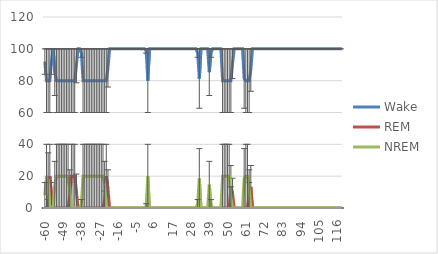
| Category | Wake | REM | NREM |
|---|---|---|---|
| -60.0 | 92 | 0 | 8 |
| -59.0 | 80 | 0 | 20 |
| -58.0 | 80 | 2.66 | 17.34 |
| -57.0 | 80 | 20 | 0 |
| -56.0 | 92 | 8 | 0 |
| -55.0 | 100 | 0 | 0 |
| -54.0 | 85.34 | 0 | 14.66 |
| -53.0 | 80 | 0 | 20 |
| -52.0 | 80 | 0 | 20 |
| -51.0 | 80 | 0 | 20 |
| -50.0 | 80 | 0 | 20 |
| -49.0 | 80 | 0 | 20 |
| -48.0 | 80 | 0 | 20 |
| -47.0 | 80 | 0 | 20 |
| -46.0 | 80 | 0 | 20 |
| -45.0 | 80 | 8 | 12 |
| -44.0 | 80 | 20 | 0 |
| -43.0 | 80 | 20 | 0 |
| -42.0 | 80 | 20 | 0 |
| -41.0 | 89.34 | 10.66 | 0 |
| -40.0 | 100 | 0 | 0 |
| -39.0 | 100 | 0 | 0 |
| -38.0 | 97.34 | 0 | 2.66 |
| -37.0 | 80 | 0 | 20 |
| -36.0 | 80 | 0 | 20 |
| -35.0 | 80 | 0 | 20 |
| -34.0 | 80 | 0 | 20 |
| -33.0 | 80 | 0 | 20 |
| -32.0 | 80 | 0 | 20 |
| -31.0 | 80 | 0 | 20 |
| -30.0 | 80 | 0 | 20 |
| -29.0 | 80 | 0 | 20 |
| -28.0 | 80 | 0 | 20 |
| -27.0 | 80 | 0 | 20 |
| -26.0 | 80 | 0 | 20 |
| -25.0 | 80 | 0 | 20 |
| -24.0 | 80 | 5.34 | 14.66 |
| -23.0 | 80 | 20 | 0 |
| -22.0 | 88 | 12 | 0 |
| -21.0 | 100 | 0 | 0 |
| -20.0 | 100 | 0 | 0 |
| -19.0 | 100 | 0 | 0 |
| -18.0 | 100 | 0 | 0 |
| -17.0 | 100 | 0 | 0 |
| -16.0 | 100 | 0 | 0 |
| -15.0 | 100 | 0 | 0 |
| -14.0 | 100 | 0 | 0 |
| -13.0 | 100 | 0 | 0 |
| -12.0 | 100 | 0 | 0 |
| -11.0 | 100 | 0 | 0 |
| -10.0 | 100 | 0 | 0 |
| -9.0 | 100 | 0 | 0 |
| -8.0 | 100 | 0 | 0 |
| -7.0 | 100 | 0 | 0 |
| -6.0 | 100 | 0 | 0 |
| -5.0 | 100 | 0 | 0 |
| -4.0 | 100 | 0 | 0 |
| -3.0 | 100 | 0 | 0 |
| -2.0 | 100 | 0 | 0 |
| -1.0 | 100 | 0 | 0 |
| 0.0 | 100 | 0 | 0 |
| 1.0 | 98.66 | 0 | 1.34 |
| 2.0 | 80 | 0 | 20 |
| 3.0 | 100 | 0 | 0 |
| 4.0 | 100 | 0 | 0 |
| 5.0 | 100 | 0 | 0 |
| 6.0 | 100 | 0 | 0 |
| 7.0 | 100 | 0 | 0 |
| 8.0 | 100 | 0 | 0 |
| 9.0 | 100 | 0 | 0 |
| 10.0 | 100 | 0 | 0 |
| 11.0 | 100 | 0 | 0 |
| 12.0 | 100 | 0 | 0 |
| 13.0 | 100 | 0 | 0 |
| 14.0 | 100 | 0 | 0 |
| 15.0 | 100 | 0 | 0 |
| 16.0 | 100 | 0 | 0 |
| 17.0 | 100 | 0 | 0 |
| 18.0 | 100 | 0 | 0 |
| 19.0 | 100 | 0 | 0 |
| 20.0 | 100 | 0 | 0 |
| 21.0 | 100 | 0 | 0 |
| 22.0 | 100 | 0 | 0 |
| 23.0 | 100 | 0 | 0 |
| 24.0 | 100 | 0 | 0 |
| 25.0 | 100 | 0 | 0 |
| 26.0 | 100 | 0 | 0 |
| 27.0 | 100 | 0 | 0 |
| 28.0 | 100 | 0 | 0 |
| 29.0 | 100 | 0 | 0 |
| 30.0 | 100 | 0 | 0 |
| 31.0 | 100 | 0 | 0 |
| 32.0 | 97.34 | 0 | 2.66 |
| 33.0 | 81.34 | 0 | 18.66 |
| 34.0 | 100 | 0 | 0 |
| 35.0 | 100 | 0 | 0 |
| 36.0 | 100 | 0 | 0 |
| 37.0 | 100 | 0 | 0 |
| 38.0 | 100 | 0 | 0 |
| 39.0 | 85.34 | 0 | 14.66 |
| 40.0 | 97.34 | 0 | 2.66 |
| 41.0 | 100 | 0 | 0 |
| 42.0 | 100 | 0 | 0 |
| 43.0 | 100 | 0 | 0 |
| 44.0 | 100 | 0 | 0 |
| 45.0 | 100 | 0 | 0 |
| 46.0 | 100 | 0 | 0 |
| 47.0 | 80 | 0 | 20 |
| 48.0 | 80 | 0 | 20 |
| 49.0 | 80 | 0 | 20 |
| 50.0 | 80 | 0 | 20 |
| 51.0 | 80 | 0 | 20 |
| 52.0 | 80 | 13.34 | 6.66 |
| 53.0 | 90.66 | 9.34 | 0 |
| 54.0 | 100 | 0 | 0 |
| 55.0 | 100 | 0 | 0 |
| 56.0 | 100 | 0 | 0 |
| 57.0 | 100 | 0 | 0 |
| 58.0 | 100 | 0 | 0 |
| 59.0 | 100 | 0 | 0 |
| 60.0 | 81.34 | 0 | 18.66 |
| 61.0 | 80 | 0 | 20 |
| 62.0 | 80 | 0 | 20 |
| 63.0 | 80 | 8 | 12 |
| 64.0 | 86.66 | 13.34 | 0 |
| 65.0 | 100 | 0 | 0 |
| 66.0 | 100 | 0 | 0 |
| 67.0 | 100 | 0 | 0 |
| 68.0 | 100 | 0 | 0 |
| 69.0 | 100 | 0 | 0 |
| 70.0 | 100 | 0 | 0 |
| 71.0 | 100 | 0 | 0 |
| 72.0 | 100 | 0 | 0 |
| 73.0 | 100 | 0 | 0 |
| 74.0 | 100 | 0 | 0 |
| 75.0 | 100 | 0 | 0 |
| 76.0 | 100 | 0 | 0 |
| 77.0 | 100 | 0 | 0 |
| 78.0 | 100 | 0 | 0 |
| 79.0 | 100 | 0 | 0 |
| 80.0 | 100 | 0 | 0 |
| 81.0 | 100 | 0 | 0 |
| 82.0 | 100 | 0 | 0 |
| 83.0 | 100 | 0 | 0 |
| 84.0 | 100 | 0 | 0 |
| 85.0 | 100 | 0 | 0 |
| 86.0 | 100 | 0 | 0 |
| 87.0 | 100 | 0 | 0 |
| 88.0 | 100 | 0 | 0 |
| 89.0 | 100 | 0 | 0 |
| 90.0 | 100 | 0 | 0 |
| 91.0 | 100 | 0 | 0 |
| 92.0 | 100 | 0 | 0 |
| 93.0 | 100 | 0 | 0 |
| 94.0 | 100 | 0 | 0 |
| 95.0 | 100 | 0 | 0 |
| 96.0 | 100 | 0 | 0 |
| 97.0 | 100 | 0 | 0 |
| 98.0 | 100 | 0 | 0 |
| 99.0 | 100 | 0 | 0 |
| 100.0 | 100 | 0 | 0 |
| 101.0 | 100 | 0 | 0 |
| 102.0 | 100 | 0 | 0 |
| 103.0 | 100 | 0 | 0 |
| 104.0 | 100 | 0 | 0 |
| 105.0 | 100 | 0 | 0 |
| 106.0 | 100 | 0 | 0 |
| 107.0 | 100 | 0 | 0 |
| 108.0 | 100 | 0 | 0 |
| 109.0 | 100 | 0 | 0 |
| 110.0 | 100 | 0 | 0 |
| 111.0 | 100 | 0 | 0 |
| 112.0 | 100 | 0 | 0 |
| 113.0 | 100 | 0 | 0 |
| 114.0 | 100 | 0 | 0 |
| 115.0 | 100 | 0 | 0 |
| 116.0 | 100 | 0 | 0 |
| 117.0 | 100 | 0 | 0 |
| 118.0 | 100 | 0 | 0 |
| 119.0 | 100 | 0 | 0 |